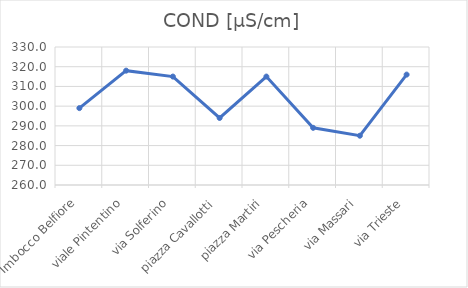
| Category | COND [µS/cm] |
|---|---|
| Imbocco Belfiore | 299 |
| viale Pintentino | 318 |
| via Solferino | 315 |
| piazza Cavallotti | 294 |
| piazza Martiri | 315 |
| via Pescheria | 289 |
| via Massari | 285 |
| via Trieste | 316 |